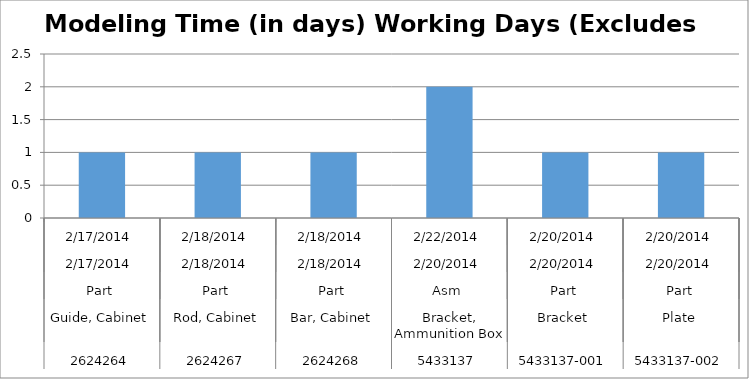
| Category | Modeling Time (in days) Working Days (Excludes weekends) |
|---|---|
| 0 | 1 |
| 1 | 1 |
| 2 | 1 |
| 3 | 2 |
| 4 | 1 |
| 5 | 1 |